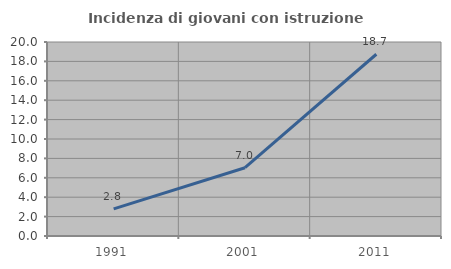
| Category | Incidenza di giovani con istruzione universitaria |
|---|---|
| 1991.0 | 2.79 |
| 2001.0 | 7.04 |
| 2011.0 | 18.736 |